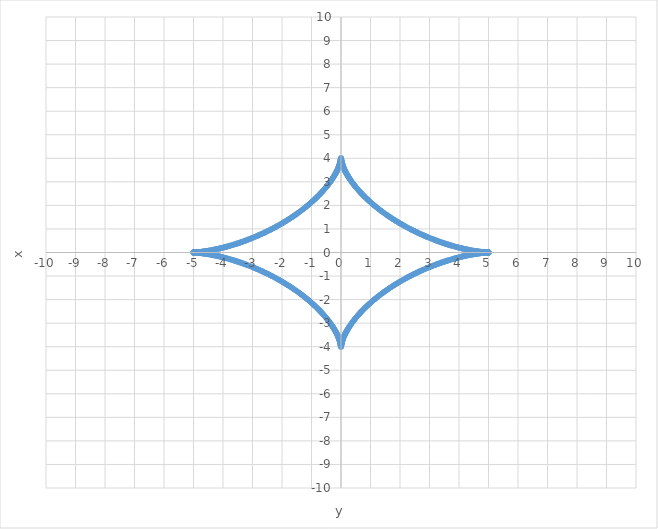
| Category | y |
|---|---|
| 0.7886430262549673 | 2.383 |
| -0.3603377787388265 | 3.007 |
| -4.851384689607516 | 0.011 |
| -1.3963461298229298 | -1.734 |
| 0.11412330441357188 | -3.527 |
| 4.426034460243971 | -0.087 |
| 2.1424718785070564 | 1.134 |
| -0.015401367611054506 | 3.874 |
| -3.781911992984833 | 0.28 |
| -2.9537039216772163 | -0.644 |
| 4.334263660979122e-07 | -4 |
| 3.00449773321259 | -0.618 |
| 3.736229095888157 | 0.297 |
| 0.012782924543936864 | 3.888 |
| -2.192177187198418 | 1.1 |
| -4.391403475549192 | -0.095 |
| -0.1041697716762603 | -3.554 |
| 1.439550364836363 | -1.694 |
| 4.832475851911501 | 0.013 |
| 0.3397915062812745 | 3.044 |
| -0.8216139988628192 | 2.343 |
| -4.999412418937827 | 0 |
| -0.7563858515974011 | -2.424 |
| 0.38160804217138555 | -2.971 |
| 4.869199631643963 | -0.009 |
| 1.3536935921761666 | 1.774 |
| -0.12466305522484677 | 3.499 |
| -4.459801368160048 | 0.08 |
| -2.0930278185021107 | -1.169 |
| 0.018350916916977496 | -3.858 |
| 3.8270697186666194 | -0.264 |
| 2.9027995402855584 | 0.671 |
| -1.170159504942323e-05 | 3.999 |
| -3.055156400821493 | 0.592 |
| -3.6900445806384017 | -0.314 |
| -0.010476838894002471 | -3.902 |
| 2.242122295863306 | -1.066 |
| 4.355926930876369 | 0.104 |
| 0.09478950047417252 | 3.581 |
| -1.4832915180377801 | 1.655 |
| -4.8124834240791685 | -0.016 |
| -0.31996475726592466 | -3.08 |
| 0.8552929773906109 | -2.302 |
| 4.997649997978831 | 0 |
| 0.7248476641400053 | 2.464 |
| -0.40360617700602097 | 2.933 |
| -4.885910961495384 | 0.008 |
| -1.3116070217190692 | -1.814 |
| 0.13580151508054114 | -3.47 |
| 4.492686114943394 | -0.072 |
| 2.043866132871279 | 1.204 |
| -0.02165006103222223 | 3.842 |
| -3.8716789221903296 | 0.248 |
| -2.8518090865645496 | -0.698 |
| 5.41655628043398e-05 | -3.997 |
| 3.105655290336749 | -0.567 |
| 3.6433821870871523 | 0.332 |
| 0.008464116421658984 | 3.915 |
| -2.2922854468215172 | 1.033 |
| -4.31962376287916 | -0.113 |
| -0.08596907940074544 | -3.607 |
| 1.5275543100846578 | -1.616 |
| 4.791418293602405 | 0.019 |
| 0.3008524816892686 | 3.115 |
| -0.8896735697438398 | 2.261 |
| -4.994713703585601 | 0 |
| -0.6940330480686974 | -2.505 |
| 0.42633547234899705 | -2.896 |
| 4.901509558262254 | -0.006 |
| 1.27010017009566 | 1.854 |
| -0.14755069901472742 | 3.441 |
| -4.524671060989201 | 0.065 |
| -1.995007610457829 | -1.24 |
| 0.025317013628662892 | -3.824 |
| 3.9157164711306165 | -0.233 |
| 2.800756965117688 | 0.726 |
| -0.00014859537221537474 | 3.994 |
| -3.1559697239949926 | 0.543 |
| -3.596265825628441 | -0.35 |
| -0.006725532477493239 | -3.927 |
| 2.342644587712212 | -1 |
| 4.28251331518836 | 0.123 |
| 0.07769465320674304 | 3.632 |
| -1.5723229710246813 | 1.577 |
| -4.769291922516509 | -0.022 |
| -0.28244905212870924 | -3.15 |
| 0.924748786911157 | -2.22 |
| 4.990605145795985 | 0 |
| 0.6639459806562407 | 2.545 |
| -0.44979862219375677 | 2.858 |
| -4.915986902893462 | 0.005 |
| -1.2291862623223917 | -1.894 |
| 0.15992213609678568 | -3.411 |
| 4.55573902344476 | -0.059 |
| 1.9464726896896694 | 1.276 |
| -0.02936969902804814 | 3.806 |
| -3.959159467038438 | 0.219 |
| -2.7496674713224136 | -0.754 |
| 0.00031572035100125255 | -3.99 |
| 3.206074996980459 | -0.519 |
| 3.548719561044205 | 0.369 |
| 0.005241647174725983 | 3.938 |
| -2.393177385999415 | 0.967 |
| -4.244615325262869 | -0.133 |
| -0.06995193414220253 | -3.657 |
| 1.6175812502053248 | -1.538 |
| 4.7461163395841 | 0.025 |
| 0.2647482692070764 | 3.185 |
| -0.9605110465405633 | 2.179 |
| -4.985326577123939 | 0 |
| -0.6345898308485586 | -2.585 |
| 0.47399772205474927 | -2.82 |
| 4.929335083998732 | -0.004 |
| 1.1888779887201193 | 1.935 |
| -0.17292685975007896 | 3.38 |
| -4.585873287904209 | 0.053 |
| -1.8982814452661811 | -1.312 |
| 0.033825737956886454 | -3.787 |
| 4.001985260947802 | -0.205 |
| 2.6985647751164477 | 0.783 |
| -0.0005762128667118088 | 3.986 |
| -3.2559463940001536 | 0.496 |
| -3.5007675962538802 | -0.389 |
| -0.003992820715147304 | -3.948 |
| 2.4438612436861944 | -0.935 |
| 4.2059499109767104 | 0.144 |
| 0.06272621360705494 | 3.68 |
| -1.663312426532094 | 1.499 |
| -4.721904132093651 | -0.029 |
| -0.24774336746607353 | -3.219 |
| 0.9969521769420793 | -2.138 |
| 4.97888089102179 | 0.001 |
| 0.6059673582874445 | 2.625 |
| -0.49893426602958413 | 2.781 |
| -4.941546803246934 | 0.003 |
| -1.149187497232203 | -1.975 |
| 0.18657539842456133 | -3.349 |
| 4.615057619786938 | -0.047 |
| 1.850453575112144 | 1.349 |
| -0.03870243351787021 | 3.768 |
| -4.044171468719905 | 0.192 |
| -2.6474729048844896 | -0.812 |
| 0.0009506721220337066 | -3.98 |
| 3.305559205878779 | -0.474 |
| 3.4524342559795134 | 0.409 |
| 0.0029592288575997017 | 3.958 |
| -2.4946733122272033 | 0.904 |
| -4.166537556951528 | -0.155 |
| -0.05600237410208199 | -3.703 |
| 1.7094993190682741 | -1.461 |
| 4.696668437278436 | 0.033 |
| 0.2314270216443984 | 3.252 |
| -1.0340634215141646 | 2.098 |
| -4.971271619905002 | -0.001 |
| -0.5780807127702429 | -2.664 |
| 0.5246091442917047 | -2.743 |
| 4.9526153803464865 | -0.002 |
| 1.1101263861340784 | 2.016 |
| -0.20087776663001594 | 3.317 |
| -4.643276275391677 | 0.042 |
| -1.8030083876078573 | -1.386 |
| 0.044016757387855536 | -3.747 |
| 4.08569598621388 | -0.179 |
| 2.596415731456527 | 0.842 |
| -0.0014596080022583058 | 3.974 |
| -3.3548887461618087 | 0.452 |
| -3.4037439703378656 | -0.43 |
| -0.002120878517975261 | -3.966 |
| 2.545590507629181 | -0.873 |
| 4.126399100644159 | 0.167 |
| 0.049764901471659434 | 3.726 |
| -1.7561242979688196 | 1.424 |
| -4.670422933361867 | -0.037 |
| -0.21579135335598942 | -3.285 |
| 1.0718354435908817 | -2.057 |
| 4.962502932740827 | 0.001 |
| 0.5509314341467767 | 2.704 |
| -0.5510226410154583 | 2.703 |
| -4.962534757604326 | 0.001 |
| -1.0717056971393293 | -2.057 |
| 0.21584345633636617 | -3.285 |
| 4.670514012618459 | -0.037 |
| 1.7559647891043575 | 1.424 |
| -0.04978533625225502 | 3.726 |
| -4.126537004273528 | 0.167 |
| -2.545416952228987 | -0.873 |
| 0.002123424986428223 | -3.966 |
| 3.403910367715013 | -0.43 |
| 3.35472125837101 | 0.452 |
| 0.0014576234896004033 | 3.974 |
| -2.5965895257288225 | 0.842 |
| -4.085555718199027 | -0.179 |
| -0.04399789742952998 | -3.747 |
| 1.8031692957407488 | -1.386 |
| 4.643181830235561 | 0.042 |
| 0.20082793816357447 | 3.317 |
| -1.1102583317064798 | 2.016 |
| -4.952579632202535 | -0.002 |
| -0.5245204526534802 | -2.743 |
| 0.5781744327351398 | -2.664 |
| 4.97129950406028 | -0.001 |
| 1.033935908907021 | 2.098 |
| -0.2314814287472455 | 3.252 |
| -4.696756101350989 | 0.033 |
| -1.7093412717324745 | -1.461 |
| 0.05602443848553366 | -3.703 |
| 4.166673023519499 | -0.155 |
| 2.4945000754198436 | 0.904 |
| -0.002962406133634136 | 3.958 |
| -3.452599479308862 | 0.409 |
| -3.305390711526983 | -0.474 |
| -0.0009491802727968017 | -3.98 |
| 2.64764685763733 | -0.812 |
| 4.044028910075333 | 0.192 |
| 0.038685092358650114 | 3.768 |
| -1.8506158188222184 | 1.349 |
| -4.614959859776655 | -0.047 |
| -0.18652781304241275 | -3.349 |
| 1.1493216052737996 | -1.975 |
| 4.941507151391232 | 0.003 |
| 0.4988480896843899 | 2.781 |
| -0.6060635871392808 | 2.624 |
| -4.978904819193905 | 0.001 |
| -0.9968269309547706 | -2.139 |
| 0.24780010645274347 | -3.218 |
| 4.721988333492064 | -0.029 |
| 1.6631559015142074 | 1.5 |
| -0.06274996108732432 | 3.68 |
| -4.206082868936528 | 0.144 |
| -2.4436884044687113 | -0.935 |
| 0.003996697155880386 | -3.948 |
| 3.5009315621761186 | -0.389 |
| 3.2557769771020735 | 0.496 |
| 0.0005751440023299134 | 3.986 |
| -2.698738805340835 | 0.783 |
| -4.00184048645909 | -0.205 |
| -0.03380985837596116 | -3.787 |
| 1.8984449594721853 | -1.312 |
| 4.5857722658111735 | 0.053 |
| 0.17288148422884841 | 3.38 |
| -1.1890142206725858 | 1.935 |
| -4.929291550127555 | -0.004 |
| -0.4739140589983409 | -2.82 |
| 0.6346885623011433 | -2.585 |
| 4.9853465362012 | 0 |
| 0.9603880979817508 | 2.179 |
| -0.26480736596698456 | 3.184 |
| -4.7461970326450516 | 0.025 |
| -1.6174263067847325 | -1.538 |
| 0.06997741688349897 | -3.657 |
| 4.2447457042455214 | -0.133 |
| 2.3930050225928383 | 0.967 |
| -0.005246290588876763 | 3.938 |
| -3.5488821865310345 | 0.369 |
| -3.2059047416563673 | -0.519 |
| -0.0003150044613875082 | -3.991 |
| 2.749841497445762 | -0.754 |
| 3.959012552470265 | 0.219 |
| 0.029355222652747606 | 3.806 |
| -1.9466374079623714 | 1.276 |
| -4.555634793730514 | -0.059 |
| -0.15987893544802342 | -3.411 |
| 1.2293245777435318 | -1.894 |
| 4.915939510815853 | 0.005 |
| 0.4497174683614024 | 2.858 |
| -0.664047206346078 | 2.545 |
| -4.990621124838907 | 0 |
| -0.9246281646055189 | -2.22 |
| 0.2825105306559169 | -3.15 |
| 4.769369063434583 | -0.022 |
| 1.5721696669330925 | 1.577 |
| -0.07772192200134437 | 3.632 |
| -4.282641046050351 | 0.123 |
| -2.3424727775098257 | -1 |
| 0.006731010072044745 | -3.927 |
| 3.5964270280385713 | -0.35 |
| 3.155798714414165 | 0.543 |
| 0.0001481621706694711 | 3.994 |
| -2.80093090505812 | 0.726 |
| -3.915567493175398 | -0.233 |
| -0.02530388098106615 | -3.824 |
| 1.9951734650630248 | -1.24 |
| 4.524563679768316 | 0.065 |
| 0.14750963651482651 | 3.441 |
| -1.270240526683566 | 1.854 |
| -4.901458333883777 | -0.006 |
| -0.4262568216232837 | -2.896 |
| 0.6941367575560844 | -2.505 |
| 4.99472569383437 | 0 |
| 0.8895553005162808 | 2.261 |
| -0.3009163640604203 | 3.115 |
| -4.791491840459948 | 0.019 |
| -1.5274027014694451 | -1.616 |
| 0.08599818362779793 | -3.607 |
| 4.3197487777494805 | -0.113 |
| 2.2921142663377543 | 1.033 |
| -0.008470494748949405 | 3.915 |
| -3.6435418842220555 | 0.332 |
| -3.1054836106609356 | -0.568 |
| -5.394454111714241e-05 | -3.997 |
| 2.8519828577855835 | -0.698 |
| 3.8715279584162565 | 0.248 |
| 0.021638211576554132 | 3.842 |
| -2.044033054813758 | 1.204 |
| -4.492575639945274 | -0.072 |
| -0.13576255230189457 | -3.47 |
| 1.3117493753376206 | -1.814 |
| 4.885855932800444 | 0.008 |
| 0.40353002122613063 | 2.934 |
| -0.724953844911619 | 2.464 |
| -4.997657992859284 | 0 |
| -0.8551770860519109 | -2.302 |
| 0.32003106361955685 | -3.079 |
| 4.812553336874867 | -0.016 |
| 1.4831416594264581 | 1.655 |
| -0.094820488059499 | 3.581 |
| -4.3560491632026155 | 0.104 |
| -2.2419518206832887 | -1.066 |
| 0.010484183799283099 | -3.902 |
| 3.6902026907978036 | -0.314 |
| 3.054984135148428 | 0.593 |
| 1.1622078765522604e-05 | 3.999 |
| -2.9029730598511687 | 0.671 |
| -3.826916847465113 | -0.264 |
| -0.01834028910776013 | -3.858 |
| 2.0931957375705528 | -1.169 |
| 4.459687858689635 | 0.08 |
| 0.12462615206822142 | 3.499 |
| -1.3538378968818527 | 1.774 |
| -4.869140828676718 | -0.009 |
| -0.3815343711438329 | -2.971 |
| 0.7564944890703724 | -2.424 |
| 4.999416414065941 | 0 |
| 0.8215005081967265 | 2.343 |
| -0.3398602547985088 | 3.044 |
| -4.832542092587663 | 0.013 |
| -1.4394023091022479 | -1.694 |
| 0.1042026890532057 | -3.554 |
| 4.391522860142799 | -0.095 |
| 2.192007491928201 | 1.1 |
| -0.012791301113434258 | 3.888 |
| -3.736385537925229 | 0.297 |
| -3.0043249655195896 | -0.618 |
| -4.2463016488083e-07 | -4 |
| 2.9538771063072033 | -0.644 |
| 3.7817572935174724 | 0.28 |
| 0.015391898941978588 | 3.874 |
| -2.14264072331981 | 1.134 |
| -4.42591797714138 | -0.087 |
| -0.11408841914167564 | -3.527 |
| 1.3964923378929828 | -1.734 |
| 4.851322144451372 | 0.011 |
| 0.36026658024965214 | 3.007 |
| -0.7887541037824402 | 2.383 |
| -4.999999993184884 | 0 |
| -0.7885319570067524 | -2.383 |
| 0.3604089856254633 | -3.007 |
| 4.851447222076017 | -0.011 |
| 1.3961999281519908 | 1.734 |
| -0.11415819648491399 | 3.527 |
| -4.426150933324528 | 0.087 |
| -2.142303036724596 | -1.134 |
| 0.015410840120573923 | -3.874 |
| 3.782066686361027 | -0.28 |
| 2.9535307357649088 | 0.644 |
| -4.423432103385336e-07 | 4 |
| -3.0046704993382383 | 0.618 |
| -3.7360726480331037 | -0.297 |
| -0.012774551597418558 | -3.888 |
| 2.1923468852501484 | -1.1 |
| 4.39128408114832 | 0.095 |
| 0.10413686094847951 | 3.555 |
| -1.4396984267981738 | 1.694 |
| -4.832409598667229 | -0.013 |
| -0.33972276610968355 | -3.044 |
| 0.8217274977409917 | -2.342 |
| 4.999408410183219 | 0 |
| 0.7562772224638756 | 2.424 |
| -0.38168172164141023 | 2.97 |
| -4.869258421810864 | 0.009 |
| -1.3535492940351057 | -1.774 |
| 0.12469996532579908 | -3.499 |
| 4.459914867398669 | -0.08 |
| 2.0928599027089914 | 1.169 |
| -0.0183615487810842 | 3.858 |
| -3.827222583506118 | 0.264 |
| -2.9026260197217653 | -0.671 |
| 1.1781473167878744e-05 | -3.999 |
| 3.0553286646414834 | -0.592 |
| 3.6898864649363716 | 0.314 |
| 0.01046949739139 | 3.902 |
| -2.2422927735724767 | 1.066 |
| -4.355804688962495 | -0.104 |
| -0.09475851938245367 | -3.581 |
| 1.4834413826995765 | -1.655 |
| 4.8124134988416385 | 0.016 |
| 0.3198984591993606 | 3.08 |
| -0.8554088768672519 | 2.302 |
| -4.997641989483094 | 0 |
| -0.7247414917610064 | -2.464 |
| 0.40368234126653435 | -2.933 |
| 4.8859659772841875 | -0.008 |
| 1.311464674824645 | 1.814 |
| -0.13584048494287543 | 3.47 |
| -4.492796579505122 | 0.072 |
| -2.043699214445244 | -1.204 |
| 0.021661914754036973 | -3.842 |
| 3.8718298793340895 | -0.248 |
| 2.851635314628394 | 0.698 |
| -5.438718723414369e-05 | 3.997 |
| -3.105826967873257 | 0.567 |
| -3.6432224846869516 | -0.332 |
| -0.008457741274053306 | -3.915 |
| 2.2924566295786546 | -1.033 |
| 4.319498738645573 | 0.113 |
| 0.08593998150659551 | 3.607 |
| -1.527705924567436 | 1.615 |
| -4.791344734435977 | -0.019 |
| -0.3007886075399123 | -3.115 |
| 0.8897918470282764 | -2.261 |
| 4.994701699740222 | 0 |
| 0.6939293470200552 | 2.505 |
| -0.4264141315865817 | 2.896 |
| -4.901560769635789 | 0.006 |
| -1.2699598203852727 | -1.854 |
| 0.14759176873204038 | -3.441 |
| 4.524778431574397 | -0.065 |
| 1.994841759606139 | 1.24 |
| -0.025330150750307524 | 3.824 |
| -3.9158654421899284 | 0.233 |
| -2.800583024743931 | -0.726 |
| 0.00014902941693969464 | -3.994 |
| 3.1561407311499727 | -0.543 |
| 3.596104618232132 | 0.35 |
| 0.006720057837146569 | 3.927 |
| -2.3428163999289437 | 1 |
| -4.282385575192034 | -0.123 |
| -0.07766739057932276 | -3.632 |
| 1.5724762807953498 | -1.576 |
| 4.769214769429068 | 0.022 |
| 0.28238758175139067 | 3.15 |
| -0.924869417185728 | 2.22 |
| -4.9905891531825795 | 0 |
| -0.6638447634442223 | -2.545 |
| 0.4498797845622894 | -2.858 |
| 4.916034281874367 | -0.005 |
| 1.229047953925961 | 1.894 |
| -0.1599653440909354 | 3.411 |
| -4.555843242329453 | 0.059 |
| -1.946307975403313 | -1.276 |
| 0.02938418008177645 | -3.806 |
| 3.959306374448005 | -0.219 |
| 2.7494934450460793 | 0.754 |
| -0.00031643732356855593 | 3.99 |
| -3.2062452495920377 | 0.519 |
| -3.5485569308519187 | -0.37 |
| -0.005237006486981416 | -3.938 |
| 2.3933497511582322 | -0.967 |
| 4.244484937379224 | 0.133 |
| 0.06992645739748429 | 3.657 |
| -1.617736199111055 | 1.538 |
| -4.746035634499776 | -0.025 |
| -0.26468918051858487 | -3.185 |
| 0.9606340029735293 | -2.179 |
| 4.985306604509754 | 0 |
| 0.6344911079058003 | 2.585 |
| -0.47408139366466684 | 2.82 |
| -4.929378604688552 | 0.004 |
| -1.1887417639332623 | -1.935 |
| 0.1729722427388154 | -3.38 |
| 4.585974298979388 | -0.053 |
| 1.898117935274991 | 1.312 |
| -0.033841622416935405 | 3.787 |
| -4.002130028018281 | 0.205 |
| -2.698390745017773 | -0.783 |
| 0.0005772830529737847 | -3.986 |
| 3.256115807899124 | -0.496 |
| 3.5006036259083215 | 0.389 |
| 0.003988946770882501 | 3.949 |
| -2.4440340843909043 | 0.935 |
| -4.2058169443534945 | -0.144 |
| -0.06270247194801817 | -3.681 |
| 1.6634689568358405 | -1.499 |
| 4.721819918824244 | 0.029 |
| 0.24768663646585515 | 3.219 |
| -0.9970774307019775 | 2.138 |
| -4.978856949353726 | -0.001 |
| -0.6058711379703684 | -2.625 |
| 0.4990204509386136 | -2.781 |
| 4.941586441843796 | -0.003 |
| 1.14905339649074 | 1.976 |
| -0.186622991390373 | 3.349 |
| -4.615155368596761 | 0.047 |
| -1.850291335840837 | -1.349 |
| 0.038719779753065696 | -3.767 |
| 4.044314019689864 | -0.192 |
| 2.647298952534233 | 0.812 |
| -0.0009521655310412426 | 3.98 |
| -3.305727696945136 | 0.473 |
| -3.4522690285102047 | -0.409 |
| -0.0029560538461372494 | -3.958 |
| 2.4948465502540436 | -0.904 |
| 4.16640208196185 | 0.155 |
| 0.05598031535991664 | 3.704 |
| -1.7096573714854517 | 1.461 |
| -4.696580761493539 | -0.033 |
| -0.2313726224366219 | -3.252 |
| 1.034190941785605 | -2.097 |
| 4.971243722302129 | 0.001 |
| 0.5779870013579649 | 2.664 |
| -0.5246978444970621 | 2.742 |
| -4.952651115161337 | 0.002 |
| -1.109994447989879 | -2.016 |
| 0.20092760279021665 | -3.317 |
| 4.643370709170541 | -0.042 |
| 1.802847484133022 | 1.386 |
| -0.04403562261500676 | 3.747 |
| -4.085836246301162 | 0.179 |
| -2.596241937861674 | -0.842 |
| 0.0014615943113548105 | -3.974 |
| 3.3550562303812907 | -0.451 |
| 3.4035775691051473 | 0.43 |
| 0.0021183340804219494 | 3.966 |
| -2.5457640639785577 | 0.873 |
| -4.126261188838695 | -0.167 |
| -0.04974447214794841 | -3.726 |
| 1.7562838117050998 | -1.423 |
| 4.670331842557746 | 0.037 |
| 0.21573925817296888 | 3.285 |
| -1.0719651975917708 | 2.057 |
| -4.962471094485437 | -0.001 |
| -0.5508402358415023 | -2.704 |
| 0.5511138564475225 | -2.703 |
| 4.962566569075733 | -0.001 |
| 1.0715759582375177 | 2.057 |
| -0.2158955671144427 | 3.285 |
| -4.670605080326949 | 0.037 |
| -1.755805285112436 | -1.424 |
| 0.049805776490370574 | -3.725 |
| 4.126674899725962 | -0.167 |
| 2.5452433977789006 | 0.873 |
| -0.0021259734865794345 | 3.966 |
| -3.4040767612356166 | 0.43 |
| -3.3545537670098695 | -0.452 |
| -0.001455640772577391 | -3.974 |
| 2.596763320677628 | -0.842 |
| 4.085415442257458 | 0.179 |
| 0.04397904273938026 | 3.747 |
| -1.8033302085309575 | 1.386 |
| -4.643087373702787 | -0.042 |
| -0.20077811739052803 | -3.317 |
| 1.110390284706658 | -2.016 |
| 4.952543870729709 | 0.002 |
| 0.5244317695823894 | 2.743 |
| -0.578268161252607 | 2.664 |
| -4.971327374767785 | 0.001 |
| -1.0338084039645536 | -2.098 |
| 0.2315358437454852 | -3.252 |
| 4.696843753710643 | -0.033 |
| 1.7091832294787563 | 1.462 |
| -0.05604650851089212 | 3.703 |
| -4.166808481664929 | 0.155 |
| -2.4943268398328815 | -0.904 |
| 0.002965585675033414 | -3.958 |
| 3.452764698497281 | -0.409 |
| 3.3052222138907195 | 0.474 |
| 0.0009476899825223389 | 3.98 |
| -2.6478208107918144 | 0.812 |
| -4.043886343757016 | -0.192 |
| -0.038667756274741734 | -3.768 |
| 1.8507780669703047 | -1.349 |
| 4.614862088566522 | 0.047 |
| 0.1864802352435418 | 3.349 |
| -1.1494557206150817 | 1.975 |
| -4.94146748627694 | -0.003 |
| -0.49876192190300794 | -2.782 |
| 0.6061598245258042 | -2.624 |
| 4.978928733869916 | -0.001 |
| 0.9967016927404077 | 2.139 |
| -0.24785685342616523 | 3.218 |
| -4.722072523018949 | 0.029 |
| -1.6629993817828699 | -1.5 |
| 0.06277371438943138 | -3.68 |
| 4.206215818232135 | -0.144 |
| 2.4435155667393604 | 0.935 |
| -0.004000576093868256 | 3.948 |
| -3.5010955236740724 | 0.389 |
| -3.25560755720586 | -0.496 |
| -0.0005740764590160641 | -3.986 |
| 2.6989128356899883 | -0.783 |
| 4.001695704553027 | 0.205 |
| 0.03379398367348247 | 3.787 |
| -1.898608477892235 | 1.312 |
| -4.585671232700915 | -0.053 |
| -0.1728361161747177 | -3.381 |
| 1.1891504597901912 | -1.935 |
| 4.929248003075294 | 0.004 |
| 0.47383040449539443 | 2.82 |
| -0.6347873022634578 | 2.585 |
| -4.985366481741412 | 0 |
| -0.9602651572974258 | -2.18 |
| 0.2648664707985879 | -3.184 |
| 4.746277713682122 | -0.025 |
| 1.6172713688499458 | 1.538 |
| -0.07000290562196276 | 3.657 |
| -4.2448760743263785 | 0.133 |
| -2.3928326609393977 | -0.967 |
| 0.005250936730213282 | -3.938 |
| 3.5490448073114518 | -0.369 |
| 3.2057344836207364 | 0.52 |
| 0.00031428965391207985 | 3.991 |
| -2.7500155234151724 | 0.754 |
| -3.958865630744376 | -0.219 |
| -0.029340750955185003 | -3.806 |
| 1.9468021302206329 | -1.276 |
| 4.555530553187363 | 0.059 |
| 0.1598357421442226 | 3.411 |
| -1.2294629001888906 | 1.894 |
| -4.91589210564184 | -0.005 |
| -0.44963632306515505 | -2.858 |
| 0.6641484405136142 | -2.545 |
| 4.990637090311246 | 0 |
| 0.9245075502691253 | 2.22 |
| -0.2825720173332698 | 3.15 |
| -4.769446192182803 | 0.022 |
| -1.5720163685212332 | -1.577 |
| 0.07774919696369954 | -3.632 |
| 4.282768767777219 | -0.123 |
| 2.3423009693226753 | 1 |
| -0.006736490621573022 | 3.927 |
| -3.5965882254615704 | 0.35 |
| -3.1556277024084634 | -0.543 |
| -0.00014772981148417143 | -3.994 |
| 2.8011048445642683 | -0.726 |
| 3.9154185083251742 | 0.233 |
| 0.025290752806815135 | 3.825 |
| -1.9953393234209247 | 1.24 |
| -4.524456287912413 | -0.065 |
| -0.147468581231892 | -3.441 |
| 1.2703808901484783 | -1.854 |
| 4.901407096500682 | 0.006 |
| 0.4261781794093469 | 2.896 |
| -0.6942404754820717 | 2.504 |
| -4.994737670486455 | 0 |
| -0.8894370393458881 | -2.261 |
| 0.3009802546536013 | -3.115 |
| 4.7915653750081395 | -0.019 |
| 1.5272510987224304 | 1.616 |
| -0.08602729418830889 | 3.607 |
| -4.319873783255765 | 0.113 |
| -2.2919430881282437 | -1.033 |
| 0.008476876256688293 | -3.915 |
| 3.643701576090711 | -0.332 |
| 3.1053119288467923 | 0.568 |
| 5.372412135281093e-05 | 3.997 |
| -2.852156628290536 | 0.698 |
| -3.8713769880127784 | -0.248 |
| -0.02162636638631884 | -3.842 |
| 2.0441999802718698 | -1.204 |
| 4.4924651545114545 | 0.072 |
| 0.13572359660647082 | 3.47 |
| -1.3118917356797644 | 1.813 |
| -4.885800891199723 | -0.008 |
| -0.4034538739267449 | -2.934 |
| 0.7250600340756788 | -2.464 |
| 4.997665974124405 | 0 |
| 0.8550612028514147 | 2.302 |
| -0.320097378260468 | 3.079 |
| -4.812623237228292 | 0.016 |
| -1.4829918068662264 | -1.655 |
| 0.09485148213897174 | -3.581 |
| 4.356171385940482 | -0.104 |
| 2.241781348033291 | 1.066 |
| -0.010491532107986808 | 3.902 |
| -3.6903607954136364 | 0.314 |
| -3.054811867623262 | -0.593 |
| -1.1542923495150467e-05 | -3.999 |
| 2.903146578417629 | -0.671 |
| 3.8267639699025175 | 0.264 |
| 0.018329665352707077 | 3.858 |
| -2.0933636599134893 | 1.169 |
| -4.459574338988134 | -0.08 |
| -0.1245892558554388 | -3.499 |
| 1.3539822081516104 | -1.773 |
| 4.869082012909505 | 0.009 |
| 0.38146070855861053 | 2.971 |
| -0.7566031348825966 | 2.424 |
| -4.999420395567538 | 0 |
| -0.8213870257429527 | -2.343 |
| 0.3399290116615743 | -3.043 |
| 4.832608320695293 | -0.013 |
| 1.4392542595964226 | 1.694 |
| -0.1042356130798367 | 3.554 |
| -4.3916422349284 | 0.095 |
| -2.1918377994403526 | -1.1 |
| 0.012799681306656291 | -3.888 |
| 3.736541974143387 | -0.297 |
| 3.004152196260214 | 0.618 |
| 4.159537850182418e-07 | 4 |
| -2.9540502896538974 | 0.644 |
| -3.7816025879598705 | -0.28 |
| -0.015382434112610612 | -3.874 |
| 2.142809571162014 | -1.134 |
| 4.425801484017474 | 0.087 |
| 0.11405354066872249 | 3.527 |
| -1.3966385523615774 | 1.734 |
| -4.851259586607982 | -0.011 |
| -0.36019539015777535 | -3.008 |
| 0.7888651895889547 | -2.383 |
| 4.9999999727395394 | 0 |
| 0.7884208960380126 | 2.384 |
| -0.36048020090972743 | 3.007 |
| -4.8515097418564785 | 0.011 |
| -1.39605373288074 | -1.734 |
| 0.1141930953562045 | -3.527 |
| 4.426267396382323 | -0.087 |
| 2.1421341979732675 | 1.135 |
| -0.015420316471272384 | 3.874 |
| -3.782221373645125 | 0.28 |
| -2.9533575485712467 | -0.644 |
| 4.513815192706427e-07 | -4 |
| 3.0048432638955664 | -0.618 |
| 3.735916194361006 | 0.297 |
| 0.012766182273133805 | 3.888 |
| -2.192516586082541 | 1.1 |
| -4.391164676940921 | -0.096 |
| -0.10410395686934261 | -3.555 |
| 1.4398464949870868 | -1.694 |
| 4.832343332855263 | 0.013 |
| 0.33965403428354773 | 3.044 |
| -0.8218410048310031 | 2.342 |
| -4.9994043878021435 | 0 |
| -0.7561686016699887 | -2.424 |
| 0.3817554095540485 | -2.97 |
| 4.86931719917705 | -0.009 |
| 1.3534050024592243 | 1.774 |
| -0.12473688237156241 | 3.499 |
| -4.4600283564047905 | 0.079 |
| -2.0926919901920225 | -1.169 |
| 0.018372184700805178 | -3.858 |
| 3.8273754419826926 | -0.264 |
| 2.9024524981607556 | 0.671 |
| -1.1861713941912285e-05 | 3.999 |
| -3.055500926607424 | 0.592 |
| -3.6897283436926527 | -0.314 |
| -0.010462159290690727 | -3.902 |
| 2.242463253809935 | -1.066 |
| 4.3556824374617555 | 0.104 |
| 0.09472754478380385 | 3.581 |
| -1.483591253411237 | 1.654 |
| -4.81234356116272 | -0.016 |
| -0.31983216941965364 | -3.08 |
| 0.8555247844815688 | -2.302 |
| 4.997633967372124 | 0 |
| 0.7246353277747924 | 2.465 |
| -0.4037585140077887 | 2.933 |
| -4.886020980166511 | 0.008 |
| -1.31132233465488 | -1.814 |
| 0.1358794618893625 | -3.47 |
| 4.492907033629773 | -0.072 |
| 2.043532299536471 | 1.205 |
| -0.0216737727427122 | 3.842 |
| -3.871980829846625 | 0.248 |
| -2.85146154197808 | -0.698 |
| 5.4609415226289053e-05 | -3.997 |
| 3.1059986432694857 | -0.567 |
| 3.643062777022399 | 0.332 |
| 0.00845136930536861 | 3.915 |
| -2.2926278146082906 | 1.032 |
| -4.319373705049498 | -0.113 |
| -0.0859108899447923 | -3.607 |
| 1.5278575449171472 | -1.615 |
| 4.791271162961127 | 0.019 |
| 0.30072474161211815 | 3.115 |
| -0.8899101323693025 | 2.261 |
| -4.994689682298311 | 0 |
| -0.6938256544103033 | -2.505 |
| 0.42649279933613227 | -2.896 |
| 4.901611968004053 | -0.006 |
| 1.2698194775529155 | 1.854 |
| -0.14763284566721102 | 3.441 |
| -4.524885791523235 | 0.065 |
| -1.9946759125087532 | -1.24 |
| 0.025343292346702156 | -3.824 |
| 3.916014406352433 | -0.233 |
| 2.8004090839378053 | 0.726 |
| -0.0001494643056602355 | 3.994 |
| -3.156311735878125 | 0.543 |
| -3.5959434058505986 | -0.351 |
| -0.006714586150232783 | -3.927 |
| 2.3429882141591345 | -0.999 |
| 4.282257826062162 | 0.123 |
| 0.07764013411851073 | 3.632 |
| -1.5726295962444468 | 1.576 |
| -4.769137604172745 | -0.022 |
| -0.2823261195237051 | -3.15 |
| 0.9249900554289213 | -2.22 |
| 4.990573146998793 | 0 |
| 0.6637435547101446 | 2.545 |
| -0.44996095546707093 | 2.858 |
| -4.916081647758264 | 0.005 |
| -1.2289096525547296 | -1.895 |
| 0.16000855943089848 | -3.411 |
| 4.55594745038394 | -0.059 |
| 1.9461432651040866 | 1.276 |
| -0.0293986658146224 | 3.806 |
| -3.959453274698077 | 0.219 |
| -2.749319418617712 | -0.754 |
| 0.00031715537990465164 | -3.99 |
| 3.2064154994901246 | -0.519 |
| 3.548394295955135 | 0.37 |
| 0.00523236852486352 | 3.938 |
| -2.393522118068389 | 0.967 |
| -4.244354540595388 | -0.133 |
| -0.0699009866487551 | -3.657 |
| 1.6178911535012517 | -1.538 |
| 4.7459549173925915 | 0.025 |
| 0.2646300999012321 | 3.185 |
| -0.960756967280314 | 2.179 |
| -4.985286618358776 | 0 |
| -0.6343923934729654 | -2.585 |
| 0.47416507382814055 | -2.82 |
| 4.9294221121967405 | -0.004 |
| 1.1886055463124834 | 1.935 |
| -0.1730176331954633 | 3.38 |
| -4.586075299036081 | 0.053 |
| -1.897954429499387 | -1.313 |
| 0.033857511756785016 | -3.787 |
| 4.002274787669648 | -0.205 |
| 2.6982167150457577 | 0.783 |
| -0.0005783545619278635 | 3.986 |
| -3.256285218798008 | 0.496 |
| -3.5004396511404074 | -0.389 |
| -0.0039850753222994565 | -3.949 |
| 2.4442069265819306 | -0.935 |
| 4.205683969067699 | 0.144 |
| 0.06267873610960893 | 3.681 |
| -1.6636254924247604 | 1.499 |
| -4.721735693684369 | -0.029 |
| -0.24762991345178786 | -3.219 |
| 0.9972026922341066 | -2.138 |
| 4.978832994189861 | 0.001 |
| 0.6057749261881249 | 2.625 |
| -0.49910664441150177 | 2.781 |
| -4.941626067181569 | 0.003 |
| -1.1489193030498575 | -1.976 |
| 0.1866705919402329 | -3.349 |
| 4.6152531062055075 | -0.047 |
| 1.8501291010090521 | 1.349 |
| -0.03873713106490024 | 3.767 |
| -4.044456562984343 | 0.192 |
| -2.6471250005874984 | -0.813 |
| 0.0009536605006275851 | -3.98 |
| 3.3058961847250776 | -0.473 |
| 3.452103796901898 | 0.409 |
| 0.0029528810984538966 | 3.958 |
| -2.4950197894994477 | 0.903 |
| -4.166266598551292 | -0.155 |
| -0.0559582622584171 | -3.704 |
| 1.7098154289833023 | -1.461 |
| 4.696493073996846 | 0.033 |
| 0.23131823112359406 | 3.252 |
| -1.0343184697209624 | 2.097 |
| -4.971215811251835 | -0.001 |
| -0.5778932984983546 | -2.664 |
| 0.5247865532695515 | -2.742 |
| 4.952686836646858 | -0.002 |
| 1.1098625172743068 | 2.016 |
| -0.20097744664454145 | 3.317 |
| -4.64346513157156 | 0.042 |
| -1.8026865853169813 | -1.386 |
| 0.04405449311163341 | -3.747 |
| 4.085976498460018 | -0.179 |
| 2.5960681449451966 | 0.842 |
| -0.001463582417693609 | 3.974 |
| -3.3552237110284846 | 0.451 |
| -3.403411164017826 | -0.43 |
| -0.002115791672969671 | -3.966 |
| 2.5459376212761917 | -0.872 |
| 4.126123268857981 | 0.167 |
| 0.04972404828048653 | 3.726 |
| -1.7564433303124758 | 1.423 |
| -4.670240740206667 | -0.038 |
| -0.21568717078696115 | -3.285 |
| 1.0720949591415945 | -2.056 |
| 4.9624392428383555 | 0.001 |
| 0.5507490460996599 | 2.704 |
| -0.551205080442944 | 2.703 |
| -4.9625983671548415 | 0.001 |
| -1.0714462268858485 | -2.057 |
| 0.2159476856905621 | -3.285 |
| 4.670696136486766 | -0.037 |
| 1.7556457859937762 | 1.424 |
| -0.04982622218664147 | 3.725 |
| -4.126812787000616 | 0.166 |
| -2.5450698442798467 | -0.873 |
| 0.002128524019227479 | -3.966 |
| 3.404243150898708 | -0.43 |
| 3.354386272079357 | 0.452 |
| 0.001453659850385544 | 3.974 |
| -2.5969371163020116 | 0.842 |
| -4.08527515839003 | -0.179 |
| -0.04396019331675656 | -3.747 |
| 1.8034911259777444 | -1.386 |
| 4.642992905793948 | 0.042 |
| 0.20072830431051192 | 3.318 |
| -1.110522245134188 | 2.016 |
| -4.952508095928236 | -0.002 |
| -0.5243430950784327 | -2.743 |
| 0.5783618983225958 | -2.664 |
| 4.97135523202734 | -0.001 |
| 1.0336809066871435 | 2.098 |
| -0.2315902666394395 | 3.252 |
| -4.696931394356849 | 0.033 |
| -1.7090251923078261 | -1.462 |
| 0.05606858417877777 | -3.703 |
| 4.1669439313869905 | -0.155 |
| 2.494153605467234 | 0.904 |
| -0.00296876748259038 | 3.958 |
| -3.452929913543805 | 0.409 |
| -3.3050537129709645 | -0.474 |
| -0.0009462012504021148 | -3.98 |
| 2.647994764347003 | -0.812 |
| 4.043743769765823 | 0.192 |
| 0.03865042526548131 | 3.768 |
| -1.850940319555649 | 1.349 |
| -4.6147643061571495 | -0.047 |
| -0.18643266502756298 | -3.349 |
| 1.149589843255602 | -1.975 |
| 4.941427807904314 | 0.003 |
| 0.4986757626854148 | 2.782 |
| -0.6062560704469417 | 2.624 |
| -4.978952635049673 | 0.001 |
| -0.9965764622993488 | -2.139 |
| 0.24791360838663906 | -3.218 |
| 4.722156700673779 | -0.029 |
| 1.6628428673387676 | 1.5 |
| -0.06279747351398113 | 3.68 |
| -4.206348758862709 | 0.144 |
| -2.44334273049905 | -0.935 |
| 0.0040044575298973885 | -3.948 |
| 3.501259480746783 | -0.389 |
| 3.255438134312489 | 0.496 |
| 0.000573010235958214 | 3.986 |
| -2.6990868661629626 | 0.783 |
| -4.001550915230487 | -0.205 |
| -0.0337781138487733 | -3.788 |
| 1.8987720005255584 | -1.312 |
| 4.585570188574065 | 0.053 |
| 0.17279075558728108 | 3.381 |
| -1.1892867060724681 | 1.934 |
| -4.929204442842232 | -0.004 |
| -0.47374675854586273 | -2.82 |
| 0.6348860507354046 | -2.584 |
| 4.985386413744449 | 0 |
| 0.9601422244879227 | 2.18 |
| -0.26492558370216457 | 3.184 |
| -4.746358382694808 | 0.025 |
| -1.6171164364016346 | -1.538 |
| 0.07002840035818297 | -3.656 |
| 4.245006435504639 | -0.133 |
| 2.3926603010399914 | 0.967 |
| -0.005255585599515034 | 3.938 |
| -3.5492074233844955 | 0.369 |
| -3.2055642228745427 | -0.52 |
| -0.0003135759277597147 | -3.991 |
| 2.750189549229694 | -0.754 |
| 3.9587187018616614 | 0.219 |
| 0.029326283934670398 | 3.806 |
| -1.9469668564636675 | 1.276 |
| -4.55542630181596 | -0.059 |
| -0.15979255618495727 | -3.411 |
| 1.2296012296579775 | -1.894 |
| 4.91584468737172 | 0.005 |
| 0.4495551863049436 | 2.858 |
| -0.6642496831587268 | 2.544 |
| -4.990653042212897 | 0 |
| -0.9243869439022876 | -2.221 |
| 0.2826335121610238 | -3.15 |
| 4.769523308760681 | -0.022 |
| 1.5718630757897563 | 1.577 |
| -0.07777647809438121 | 3.632 |
| -4.28289648036818 | 0.123 |
| -2.342129163151645 | -1 |
| 0.00674197412684997 | -3.927 |
| 3.596749417896485 | -0.35 |
| 3.1554566879788664 | 0.543 |
| 0.0001472982938416559 | 3.994 |
| -2.8012787836351762 | 0.725 |
| -3.915269516580842 | -0.233 |
| -0.02527762910520769 | -3.825 |
| 1.9955051855307282 | -1.24 |
| 4.524348885422159 | 0.065 |
| 0.14742753316547796 | 3.441 |
| -1.2705212604898857 | 1.854 |
| -4.901355846113291 | -0.006 |
| -0.42609954570709213 | -2.896 |
| 0.694344201846514 | -2.504 |
| 4.994749633541777 | 0 |
| 0.8893187862329484 | 2.261 |